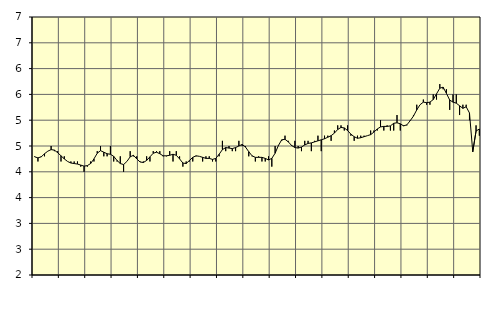
| Category | Piggar | Personliga och kulturella tjänster, SNI 90-98 |
|---|---|---|
| nan | 4.3 | 4.29 |
| 87.0 | 4.2 | 4.27 |
| 87.0 | 4.3 | 4.29 |
| 87.0 | 4.3 | 4.35 |
| nan | 4.4 | 4.4 |
| 88.0 | 4.5 | 4.43 |
| 88.0 | 4.4 | 4.42 |
| 88.0 | 4.4 | 4.37 |
| nan | 4.2 | 4.31 |
| 89.0 | 4.3 | 4.25 |
| 89.0 | 4.2 | 4.2 |
| 89.0 | 4.2 | 4.17 |
| nan | 4.2 | 4.16 |
| 90.0 | 4.2 | 4.15 |
| 90.0 | 4.1 | 4.13 |
| 90.0 | 4 | 4.11 |
| nan | 4.1 | 4.12 |
| 91.0 | 4.2 | 4.16 |
| 91.0 | 4.2 | 4.25 |
| 91.0 | 4.4 | 4.36 |
| nan | 4.5 | 4.41 |
| 92.0 | 4.3 | 4.38 |
| 92.0 | 4.3 | 4.35 |
| 92.0 | 4.5 | 4.34 |
| nan | 4.2 | 4.3 |
| 93.0 | 4.2 | 4.22 |
| 93.0 | 4.3 | 4.16 |
| 93.0 | 4 | 4.14 |
| nan | 4.2 | 4.2 |
| 94.0 | 4.4 | 4.29 |
| 94.0 | 4.3 | 4.32 |
| 94.0 | 4.3 | 4.25 |
| nan | 4.2 | 4.19 |
| 95.0 | 4.2 | 4.18 |
| 95.0 | 4.3 | 4.22 |
| 95.0 | 4.2 | 4.29 |
| nan | 4.4 | 4.36 |
| 96.0 | 4.4 | 4.38 |
| 96.0 | 4.4 | 4.35 |
| 96.0 | 4.3 | 4.31 |
| nan | 4.3 | 4.31 |
| 97.0 | 4.4 | 4.32 |
| 97.0 | 4.2 | 4.34 |
| 97.0 | 4.4 | 4.32 |
| nan | 4.3 | 4.25 |
| 98.0 | 4.1 | 4.17 |
| 98.0 | 4.2 | 4.16 |
| 98.0 | 4.2 | 4.22 |
| nan | 4.2 | 4.28 |
| 99.0 | 4.3 | 4.31 |
| 99.0 | 4.3 | 4.3 |
| 99.0 | 4.2 | 4.28 |
| nan | 4.3 | 4.26 |
| 0.0 | 4.3 | 4.26 |
| 0.0 | 4.2 | 4.24 |
| 0.0 | 4.2 | 4.26 |
| nan | 4.3 | 4.34 |
| 1.0 | 4.6 | 4.43 |
| 1.0 | 4.4 | 4.47 |
| 1.0 | 4.5 | 4.46 |
| nan | 4.4 | 4.45 |
| 2.0 | 4.4 | 4.47 |
| 2.0 | 4.6 | 4.5 |
| 2.0 | 4.5 | 4.53 |
| nan | 4.5 | 4.48 |
| 3.0 | 4.3 | 4.39 |
| 3.0 | 4.3 | 4.31 |
| 3.0 | 4.2 | 4.28 |
| nan | 4.3 | 4.28 |
| 4.0 | 4.2 | 4.28 |
| 4.0 | 4.2 | 4.26 |
| 4.0 | 4.3 | 4.23 |
| nan | 4.1 | 4.26 |
| 5.0 | 4.5 | 4.36 |
| 5.0 | 4.5 | 4.51 |
| 5.0 | 4.6 | 4.62 |
| nan | 4.7 | 4.63 |
| 6.0 | 4.6 | 4.58 |
| 6.0 | 4.5 | 4.51 |
| 6.0 | 4.6 | 4.47 |
| nan | 4.5 | 4.46 |
| 7.0 | 4.4 | 4.48 |
| 7.0 | 4.6 | 4.52 |
| 7.0 | 4.6 | 4.55 |
| nan | 4.4 | 4.56 |
| 8.0 | 4.6 | 4.58 |
| 8.0 | 4.7 | 4.6 |
| 8.0 | 4.4 | 4.62 |
| nan | 4.7 | 4.64 |
| 9.0 | 4.7 | 4.67 |
| 9.0 | 4.6 | 4.7 |
| 9.0 | 4.8 | 4.75 |
| nan | 4.9 | 4.82 |
| 10.0 | 4.9 | 4.86 |
| 10.0 | 4.8 | 4.85 |
| 10.0 | 4.9 | 4.8 |
| nan | 4.7 | 4.73 |
| 11.0 | 4.6 | 4.68 |
| 11.0 | 4.7 | 4.65 |
| 11.0 | 4.7 | 4.66 |
| nan | 4.7 | 4.68 |
| 12.0 | 4.7 | 4.7 |
| 12.0 | 4.8 | 4.72 |
| 12.0 | 4.8 | 4.77 |
| nan | 4.8 | 4.83 |
| 13.0 | 5 | 4.87 |
| 13.0 | 4.8 | 4.88 |
| 13.0 | 4.9 | 4.88 |
| nan | 4.8 | 4.89 |
| 14.0 | 4.8 | 4.94 |
| 14.0 | 5.1 | 4.95 |
| 14.0 | 4.8 | 4.93 |
| nan | 4.9 | 4.89 |
| 15.0 | 4.9 | 4.91 |
| 15.0 | 5 | 4.99 |
| 15.0 | 5.1 | 5.08 |
| nan | 5.3 | 5.2 |
| 16.0 | 5.3 | 5.3 |
| 16.0 | 5.4 | 5.35 |
| 16.0 | 5.3 | 5.34 |
| nan | 5.3 | 5.35 |
| 17.0 | 5.5 | 5.4 |
| 17.0 | 5.4 | 5.51 |
| 17.0 | 5.7 | 5.62 |
| nan | 5.6 | 5.64 |
| 18.0 | 5.6 | 5.52 |
| 18.0 | 5.2 | 5.39 |
| 18.0 | 5.5 | 5.35 |
| nan | 5.5 | 5.33 |
| 19.0 | 5.1 | 5.28 |
| 19.0 | 5.3 | 5.23 |
| 19.0 | 5.3 | 5.26 |
| nan | 5 | 5.14 |
| 20.0 | 4.4 | 4.39 |
| 20.0 | 4.9 | 4.79 |
| 20.0 | 4.7 | 4.83 |